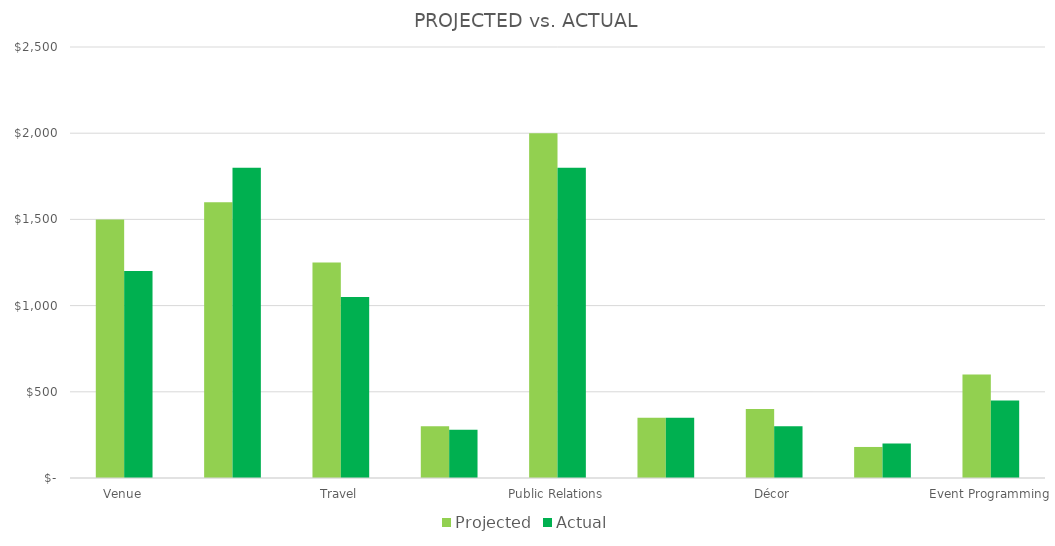
| Category | Projected | Actual |
|---|---|---|
| Venue | 1500 | 1200 |
| Travel | 1600 | 1800 |
| Public Relations | 1250 | 1050 |
| Décor | 300 | 280 |
| Event Programming | 2000 | 1800 |
| Social Media | 350 | 350 |
| Advertising | 400 | 300 |
| Refreshments | 180 | 200 |
| Other | 600 | 450 |